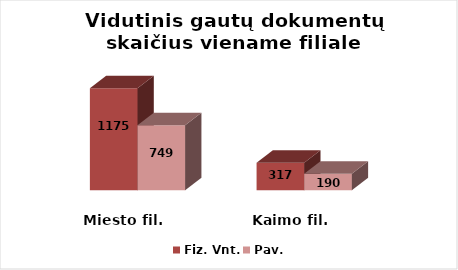
| Category | Fiz. Vnt. | Pav. |
|---|---|---|
| Miesto fil. | 1175 | 749 |
| Kaimo fil. | 317 | 190 |